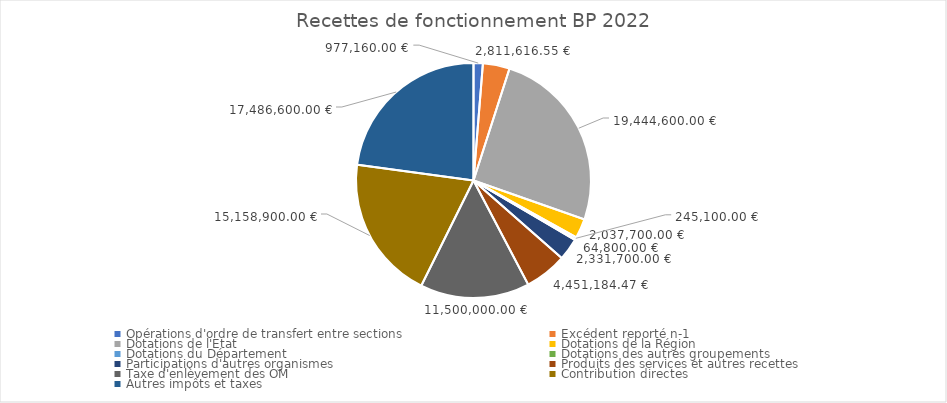
| Category | Series 0 | Series 1 |
|---|---|---|
| Opérations d'ordre de transfert entre sections | 977160 | 0.013 |
| Excédent reporté n-1 | 2811616.55 | 0.037 |
| Dotations de l'Etat | 19444600 | 0.254 |
| Dotations de la Région | 2037700 | 0.027 |
| Dotations du Département | 245100 | 0.003 |
| Dotations des autres groupements | 64800 | 0.001 |
| Participations d'autres organismes | 2331700 | 0.03 |
| Produits des services et autres recettes | 4451184.47 | 0.058 |
| Taxe d'enlèvement des OM | 11500000 | 0.15 |
| Contribution directes | 15158900 | 0.198 |
| Autres impôts et taxes | 17486600 | 0.229 |